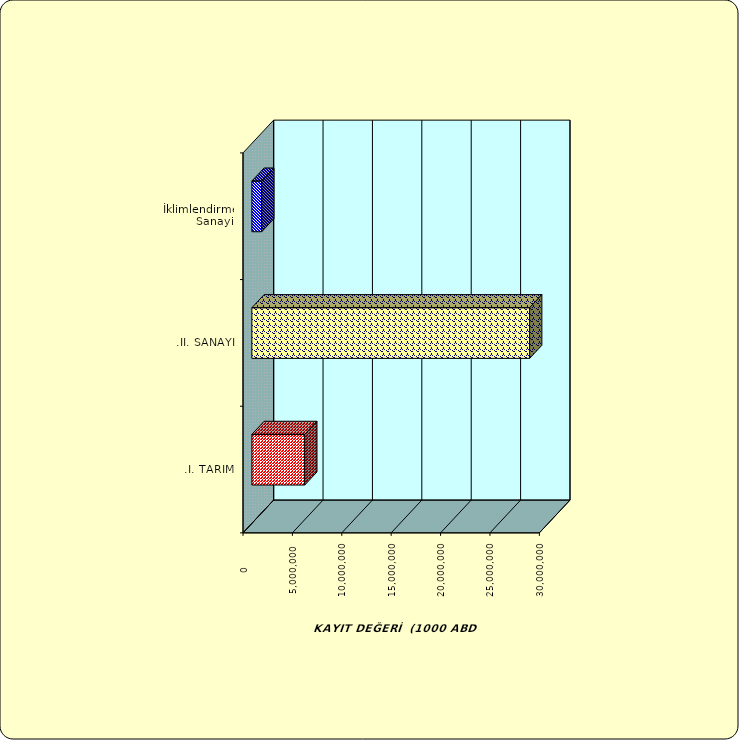
| Category | Series 0 |
|---|---|
| .I. TARIM | 5351377.523 |
| .II. SANAYİ | 28116141.958 |
|  İklimlendirme Sanayii | 997107 |